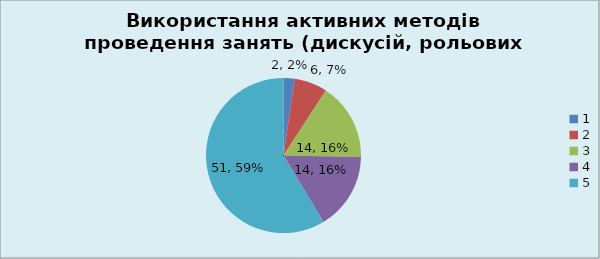
| Category | Кількість | % |
|---|---|---|
| 0 | 2 | 0.023 |
| 1 | 6 | 0.069 |
| 2 | 14 | 0.161 |
| 3 | 14 | 0.161 |
| 4 | 51 | 0.586 |